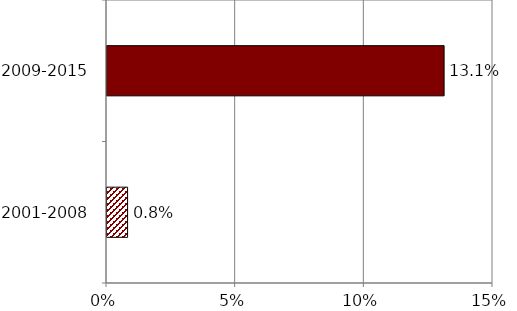
| Category | x |
|---|---|
| 2001-2008 | 0.008 |
| 2009-2015 | 0.131 |